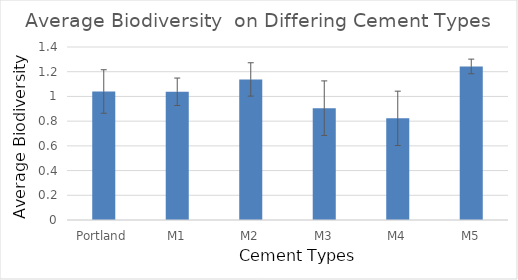
| Category | Series 0 |
|---|---|
| Portland | 1.04 |
| M1 | 1.037 |
| M2 | 1.138 |
| M3 | 0.905 |
| M4 | 0.822 |
| M5 | 1.243 |